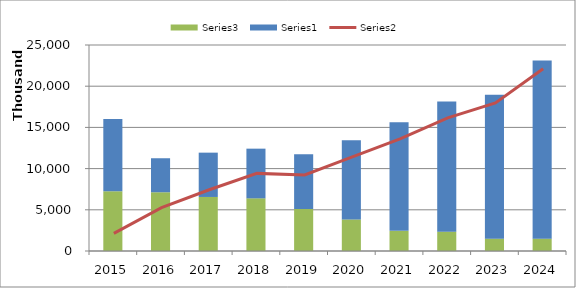
| Category | Series 2 | Series 0 |
|---|---|---|
| 2015.0 | 7257181 | 8752223 |
| 2016.0 | 7129323 | 4127675 |
| 2017.0 | 6557276 | 5378400 |
| 2018.0 | 6390929 | 6029408 |
| 2019.0 | 5108276 | 6629213 |
| 2020.0 | 3834612 | 9599774 |
| 2021.0 | 2450000 | 13166969 |
| 2022.0 | 2350000 | 15805899 |
| 2023.0 | 1500000 | 17468732 |
| 2024.0 | 1500000 | 21615231 |